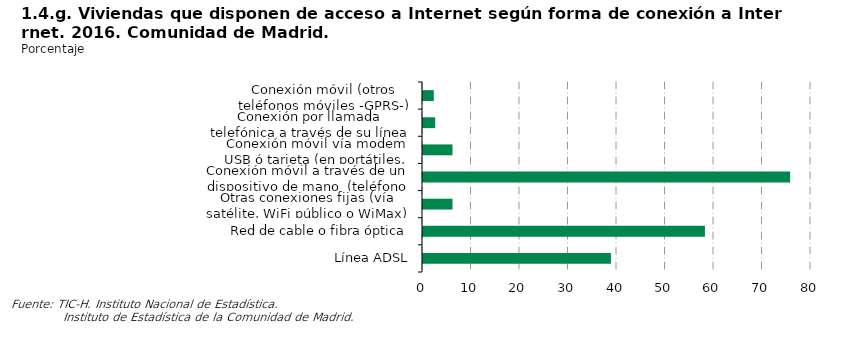
| Category | Series 0 |
|---|---|
| Línea ADSL | 38.746 |
| Red de cable o fibra óptica | 58.133 |
| Otras conexiones fijas (vía satélite, WiFi público o WiMax) | 6.077 |
| Conexión móvil a través de un dispositivo de mano  (teléfono móvil de últimas generaciones -al menos 3G-, iPod,...) | 75.698 |
| Conexión móvil vía modem USB ó tarjeta (en portátiles, p.ej.) | 6.077 |
| Conexión por llamada telefónica a través de su línea de teléfono convencional (módem) o RDSI | 2.514 |
| Conexión móvil (otros teléfonos móviles -GPRS-) | 2.221 |